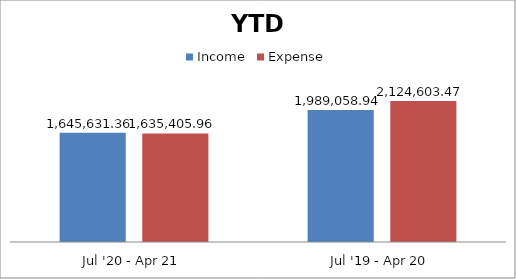
| Category | Income | Expense |
|---|---|---|
| Jul '20 - Apr 21 | 1645631.36 | 1635405.96 |
| Jul '19 - Apr 20 | 1989058.94 | 2124603.47 |